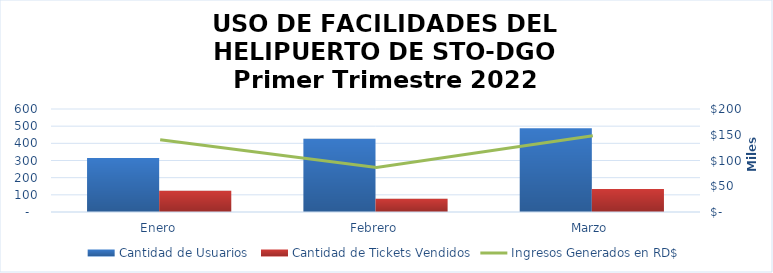
| Category | Cantidad de Usuarios  | Cantidad de Tickets Vendidos |
|---|---|---|
| Enero | 314 | 124 |
| Febrero | 426 | 77 |
| Marzo | 488 | 134 |